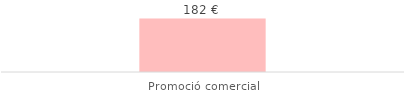
| Category | Total |
|---|---|
| Promoció comercial | 181.5 |